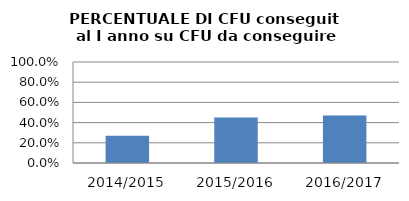
| Category | 2014/2015 2015/2016 2016/2017 |
|---|---|
| 2014/2015 | 0.269 |
| 2015/2016 | 0.451 |
| 2016/2017 | 0.469 |